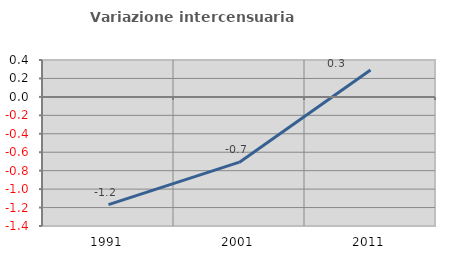
| Category | Variazione intercensuaria annua |
|---|---|
| 1991.0 | -1.169 |
| 2001.0 | -0.708 |
| 2011.0 | 0.291 |